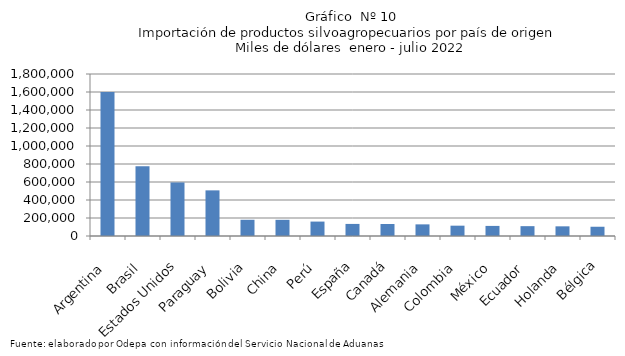
| Category | Series 0 |
|---|---|
| Argentina | 1599582.946 |
| Brasil | 773763.181 |
| Estados Unidos | 594913.576 |
| Paraguay | 507029.297 |
| Bolivia | 180300.127 |
| China | 179702.914 |
| Perú | 160179.492 |
| España | 134248.333 |
| Canadá | 133045.155 |
| Alemania | 129247.336 |
| Colombia | 114706.28 |
| México | 112094.394 |
| Ecuador | 109355.261 |
| Holanda | 107385.271 |
| Bélgica | 102860.331 |